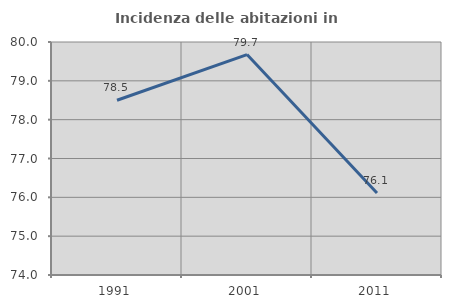
| Category | Incidenza delle abitazioni in proprietà  |
|---|---|
| 1991.0 | 78.501 |
| 2001.0 | 79.676 |
| 2011.0 | 76.113 |